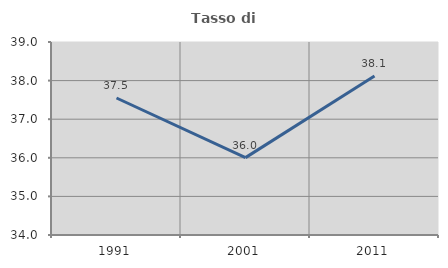
| Category | Tasso di occupazione   |
|---|---|
| 1991.0 | 37.549 |
| 2001.0 | 36.004 |
| 2011.0 | 38.12 |